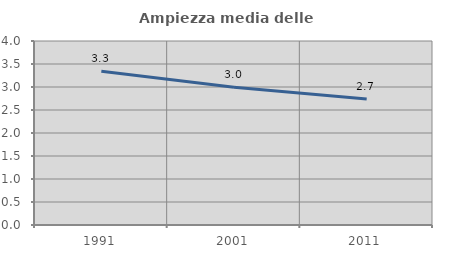
| Category | Ampiezza media delle famiglie |
|---|---|
| 1991.0 | 3.344 |
| 2001.0 | 2.994 |
| 2011.0 | 2.741 |